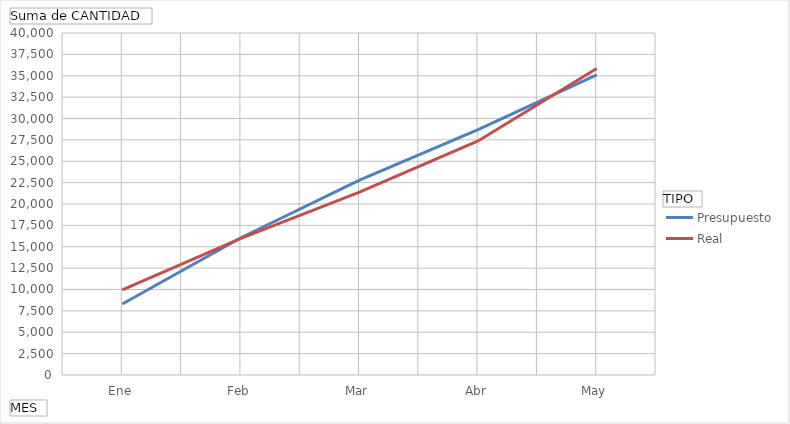
| Category | Presupuesto | Real |
|---|---|---|
| Ene | 8300 | 9950 |
| Feb | 16050 | 15975 |
| Mar | 22800 | 21400 |
| Abr | 28700 | 27375 |
| May | 35100 | 35850 |